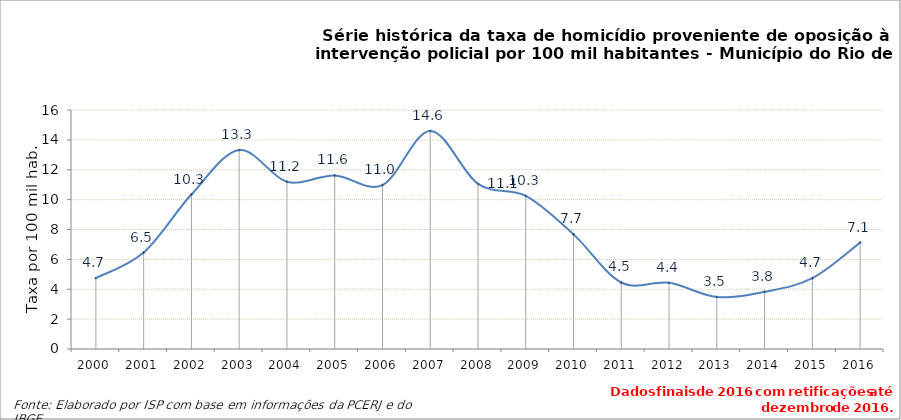
| Category | Series 0 |
|---|---|
| 2000.0 | 4.746 |
| 2001.0 | 6.455 |
| 2002.0 | 10.34 |
| 2003.0 | 13.316 |
| 2004.0 | 11.194 |
| 2005.0 | 11.619 |
| 2006.0 | 10.977 |
| 2007.0 | 14.6 |
| 2008.0 | 11.052 |
| 2009.0 | 10.251 |
| 2010.0 | 7.674 |
| 2011.0 | 4.453 |
| 2012.0 | 4.429 |
| 2013.0 | 3.484 |
| 2014.0 | 3.827 |
| 2015.0 | 4.74 |
| 2016.0 | 7.124 |